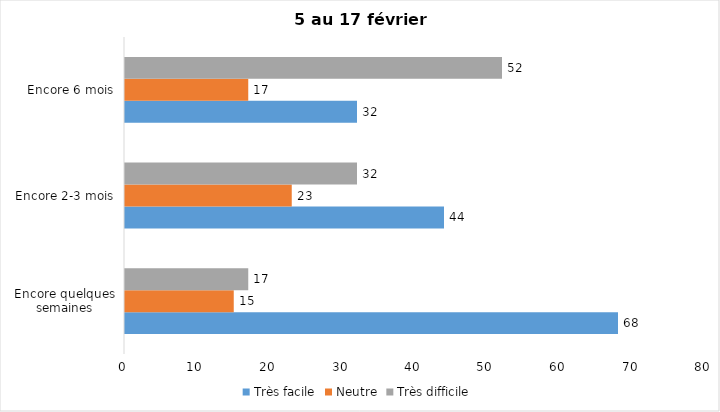
| Category | Très facile | Neutre | Très difficile |
|---|---|---|---|
| Encore quelques semaines | 68 | 15 | 17 |
| Encore 2-3 mois | 44 | 23 | 32 |
| Encore 6 mois | 32 | 17 | 52 |